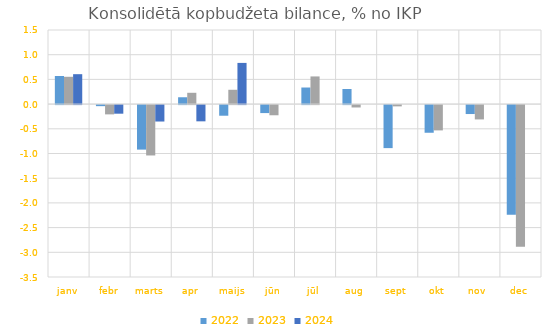
| Category | 2022 | 2023 | 2024 |
|---|---|---|---|
| janv | 0.569 | 0.553 | 0.606 |
| febr | -0.021 | -0.188 | -0.174 |
| marts | -0.901 | -1.02 | -0.332 |
| apr | 0.138 | 0.229 | -0.329 |
| maijs | -0.215 | 0.29 | 0.834 |
| jūn | -0.161 | -0.206 | 0 |
| jūl | 0.336 | 0.56 | 0 |
| aug | 0.306 | -0.048 | 0 |
| sept | -0.871 | -0.026 | 0 |
| okt | -0.56 | -0.512 | 0 |
| nov | -0.181 | -0.29 | 0 |
| dec | -2.218 | -2.869 | 0 |